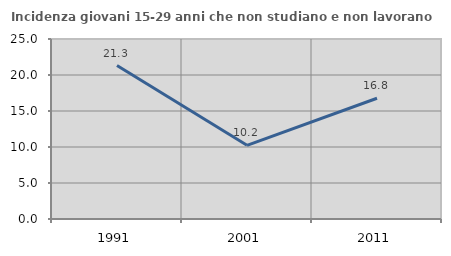
| Category | Incidenza giovani 15-29 anni che non studiano e non lavorano  |
|---|---|
| 1991.0 | 21.316 |
| 2001.0 | 10.233 |
| 2011.0 | 16.77 |